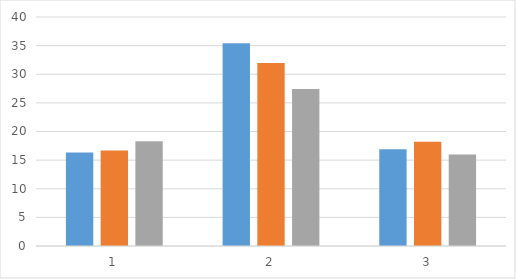
| Category | control | 5 min | 20 min |
|---|---|---|---|
| 0 | 16.348 | 16.691 | 18.311 |
| 1 | 35.428 | 31.948 | 27.411 |
| 2 | 16.916 | 18.229 | 15.973 |